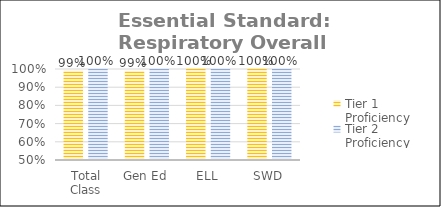
| Category | Tier 1 Proficiency | Tier 2 Proficiency |
|---|---|---|
| Total Class | 0.991 | 1 |
| Gen Ed | 0.99 | 1 |
| ELL | 1 | 1 |
| SWD | 1 | 1 |